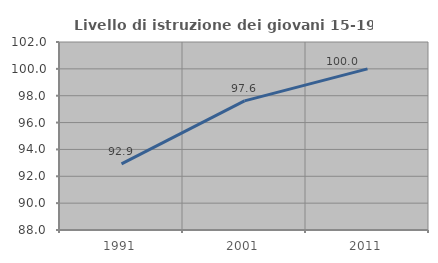
| Category | Livello di istruzione dei giovani 15-19 anni |
|---|---|
| 1991.0 | 92.92 |
| 2001.0 | 97.619 |
| 2011.0 | 100 |